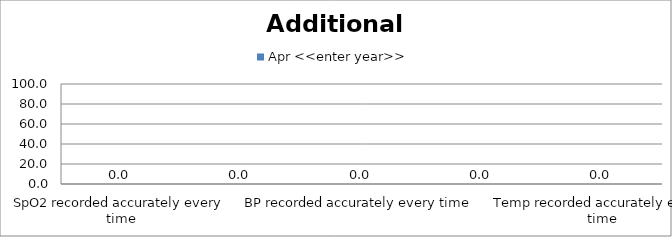
| Category | Apr <<enter year>> |
|---|---|
| SpO2 recorded accurately every time | 0 |
| CRT recorded accurately every time | 0 |
| BP recorded accurately every time | 0 |
| Skin Colour recorded accurately every time | 0 |
| Temp recorded accurately every time | 0 |